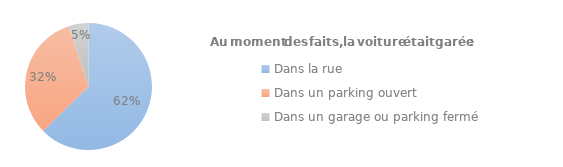
| Category | Series 0 |
|---|---|
| Dans la rue | 0.62 |
| Dans un parking ouvert | 0.32 |
| Dans un garage ou parking fermé | 0.05 |